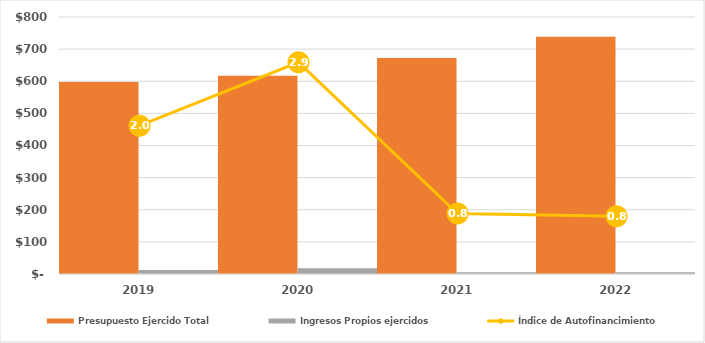
| Category | Presupuesto Ejercido Total | Ingresos Propios ejercidos |
|---|---|---|
| 2019.0 | 598040.902 | 12076.572 |
| 2020.0 | 617347.742 | 17799.164 |
| 2021.0 | 672172.234 | 5535.108 |
| 2022.0 | 738205.545 | 5804.492 |